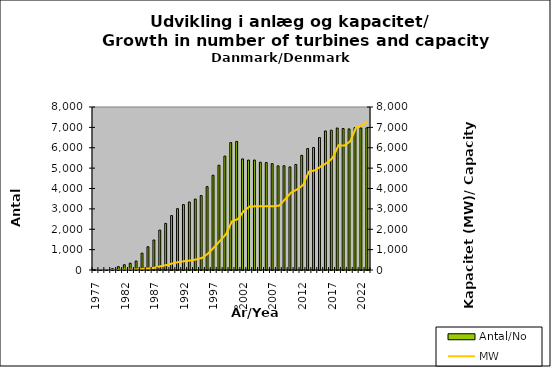
| Category | Antal/No |
|---|---|
| 1977.0 | 3 |
| 1978.0 | 12 |
| 1979.0 | 22 |
| 1980.0 | 66 |
| 1981.0 | 165 |
| 1982.0 | 259 |
| 1983.0 | 334 |
| 1984.0 | 439 |
| 1985.0 | 828 |
| 1986.0 | 1141 |
| 1987.0 | 1473 |
| 1988.0 | 1959 |
| 1989.0 | 2289 |
| 1990.0 | 2670 |
| 1991.0 | 3010 |
| 1992.0 | 3210 |
| 1993.0 | 3338 |
| 1994.0 | 3482 |
| 1995.0 | 3653 |
| 1996.0 | 4092 |
| 1997.0 | 4650 |
| 1998.0 | 5142 |
| 1999.0 | 5589 |
| 2000.0 | 6253 |
| 2001.0 | 6310 |
| 2002.0 | 5453 |
| 2003.0 | 5394 |
| 2004.0 | 5398 |
| 2005.0 | 5289 |
| 2006.0 | 5272 |
| 2007.0 | 5220 |
| 2008.0 | 5111 |
| 2009.0 | 5117 |
| 2010.0 | 5060 |
| 2011.0 | 5179 |
| 2012.0 | 5628 |
| 2013.0 | 5961 |
| 2014.0 | 6013 |
| 2015.0 | 6500 |
| 2016.0 | 6825 |
| 2017.0 | 6860 |
| 2018.0 | 6969 |
| 2019.0 | 6944 |
| 2020.0 | 6924 |
| 2021.0 | 6990 |
| 2022.0 | 6969 |
| 2023.0 | 6974 |